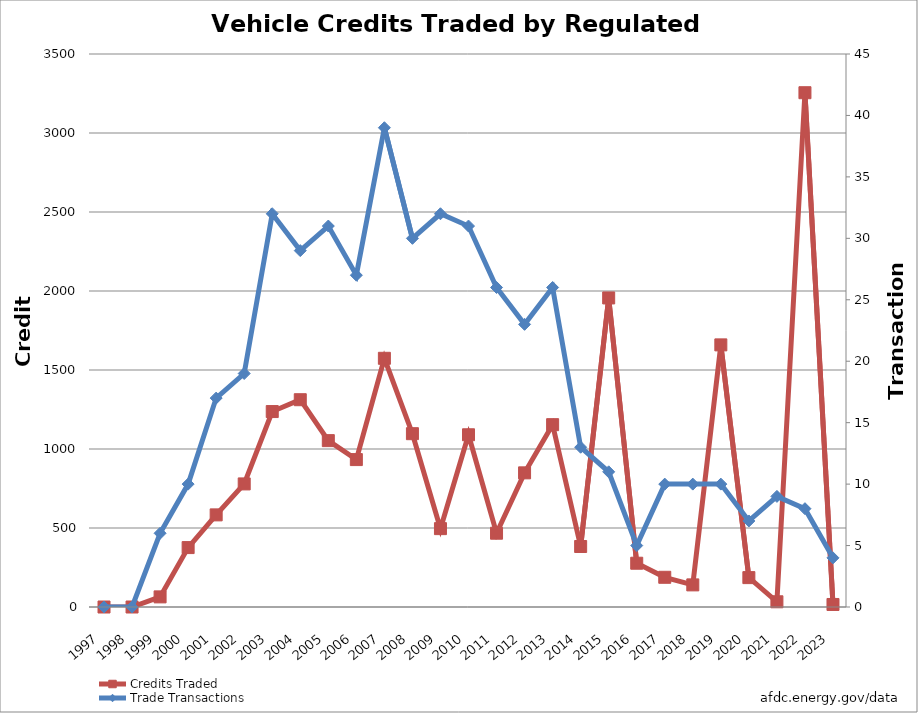
| Category | Credits Traded |
|---|---|
| 1997.0 | 0 |
| 1998.0 | 0 |
| 1999.0 | 64 |
| 2000.0 | 376 |
| 2001.0 | 583 |
| 2002.0 | 779 |
| 2003.0 | 1237 |
| 2004.0 | 1312 |
| 2005.0 | 1053 |
| 2006.0 | 933 |
| 2007.0 | 1574 |
| 2008.0 | 1097 |
| 2009.0 | 496 |
| 2010.0 | 1090 |
| 2011.0 | 467 |
| 2012.0 | 849 |
| 2013.0 | 1154 |
| 2014.0 | 383 |
| 2015.0 | 1956 |
| 2016.0 | 277 |
| 2017.0 | 188 |
| 2018.0 | 140 |
| 2019.0 | 1659 |
| 2020.0 | 186 |
| 2021.0 | 33 |
| 2022.0 | 3255 |
| 2023.0 | 16 |